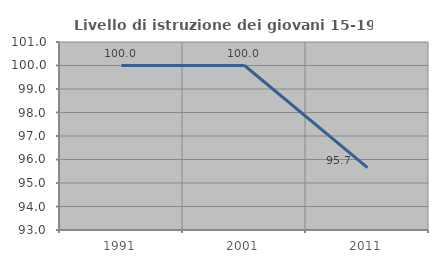
| Category | Livello di istruzione dei giovani 15-19 anni |
|---|---|
| 1991.0 | 100 |
| 2001.0 | 100 |
| 2011.0 | 95.652 |